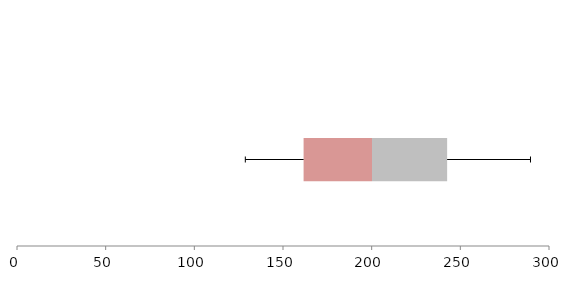
| Category | Series 1 | Series 2 | Series 3 |
|---|---|---|---|
| 0 | 161.614 | 38.576 | 42.367 |